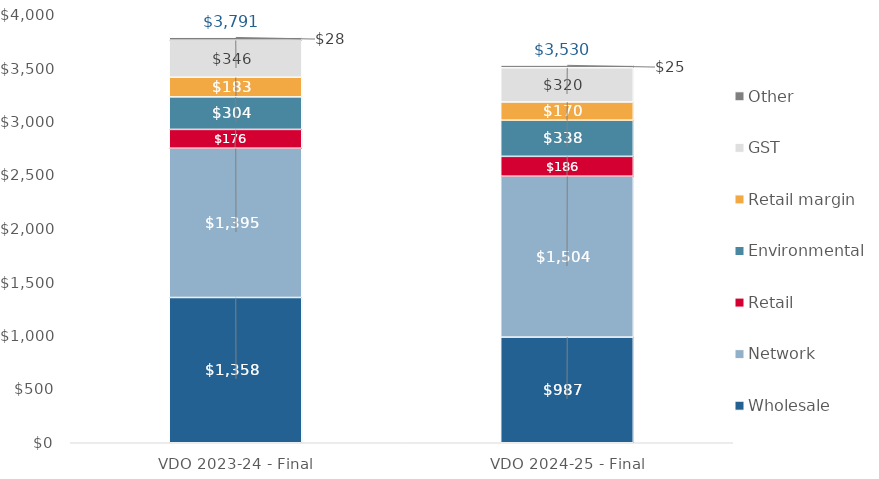
| Category | Wholesale | Network | Retail | Environmental | Retail margin | GST | Other |
|---|---|---|---|---|---|---|---|
| VDO 2023-24 - Final | 1357.552 | 1395.197 | 175.924 | 303.861 | 183.406 | 345.852 | 28.443 |
| VDO 2024-25 - Final | 987.263 | 1503.69 | 185.868 | 338.042 | 169.857 | 320.301 | 24.738 |